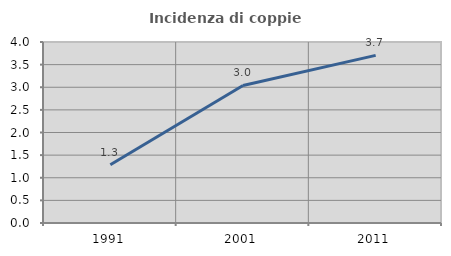
| Category | Incidenza di coppie miste |
|---|---|
| 1991.0 | 1.286 |
| 2001.0 | 3.04 |
| 2011.0 | 3.704 |